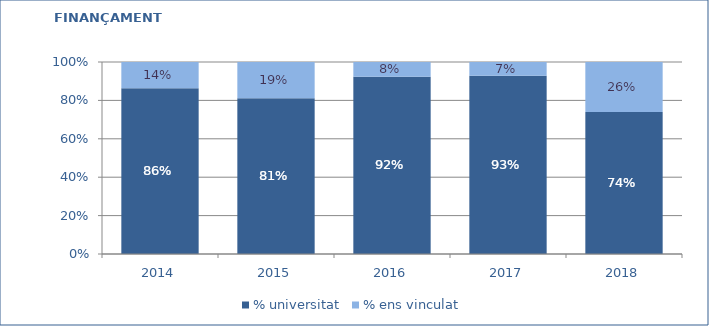
| Category | % universitat | % ens vinculat |
|---|---|---|
| 2014.0 | 0.863 | 0.137 |
| 2015.0 | 0.811 | 0.189 |
| 2016.0 | 0.923 | 0.077 |
| 2017.0 | 0.928 | 0.072 |
| 2018.0 | 0.739 | 0.261 |